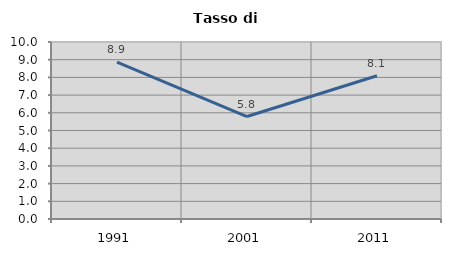
| Category | Tasso di disoccupazione   |
|---|---|
| 1991.0 | 8.863 |
| 2001.0 | 5.789 |
| 2011.0 | 8.095 |